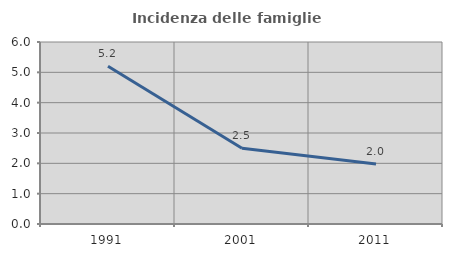
| Category | Incidenza delle famiglie numerose |
|---|---|
| 1991.0 | 5.201 |
| 2001.0 | 2.496 |
| 2011.0 | 1.979 |